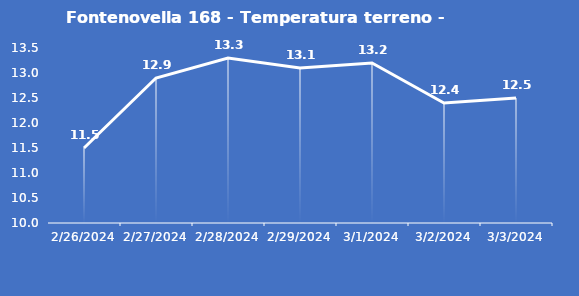
| Category | Fontenovella 168 - Temperatura terreno - Grezzo (°C) |
|---|---|
| 2/26/24 | 11.5 |
| 2/27/24 | 12.9 |
| 2/28/24 | 13.3 |
| 2/29/24 | 13.1 |
| 3/1/24 | 13.2 |
| 3/2/24 | 12.4 |
| 3/3/24 | 12.5 |